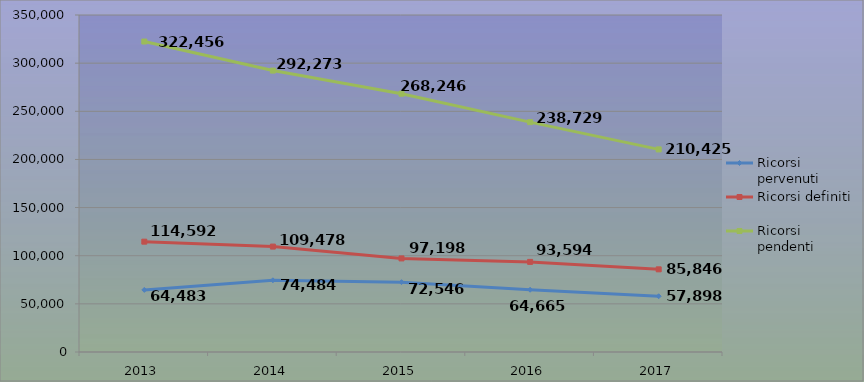
| Category | Ricorsi pervenuti | Ricorsi definiti | Ricorsi pendenti |
|---|---|---|---|
| 2013.0 | 64483 | 114592 | 322456 |
| 2014.0 | 74484 | 109478 | 292273 |
| 2015.0 | 72546 | 97198 | 268246 |
| 2016.0 | 64665 | 93594 | 238729 |
| 2017.0 | 57898 | 85846 | 210425 |